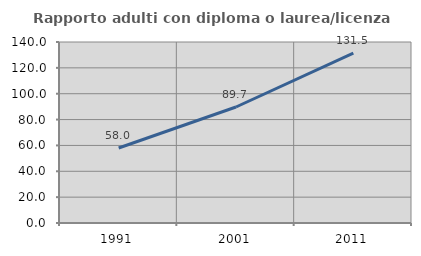
| Category | Rapporto adulti con diploma o laurea/licenza media  |
|---|---|
| 1991.0 | 58.012 |
| 2001.0 | 89.721 |
| 2011.0 | 131.465 |